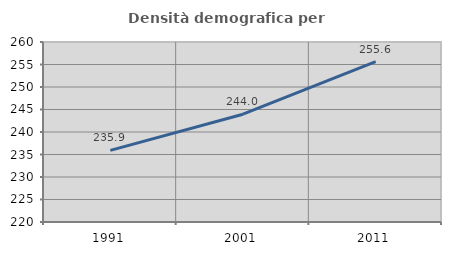
| Category | Densità demografica |
|---|---|
| 1991.0 | 235.915 |
| 2001.0 | 243.96 |
| 2011.0 | 255.635 |